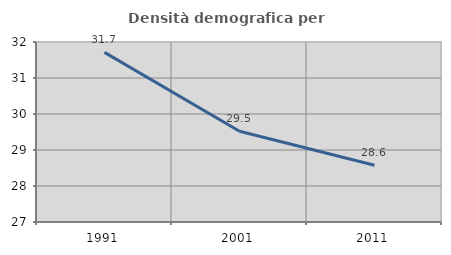
| Category | Densità demografica |
|---|---|
| 1991.0 | 31.711 |
| 2001.0 | 29.522 |
| 2011.0 | 28.578 |